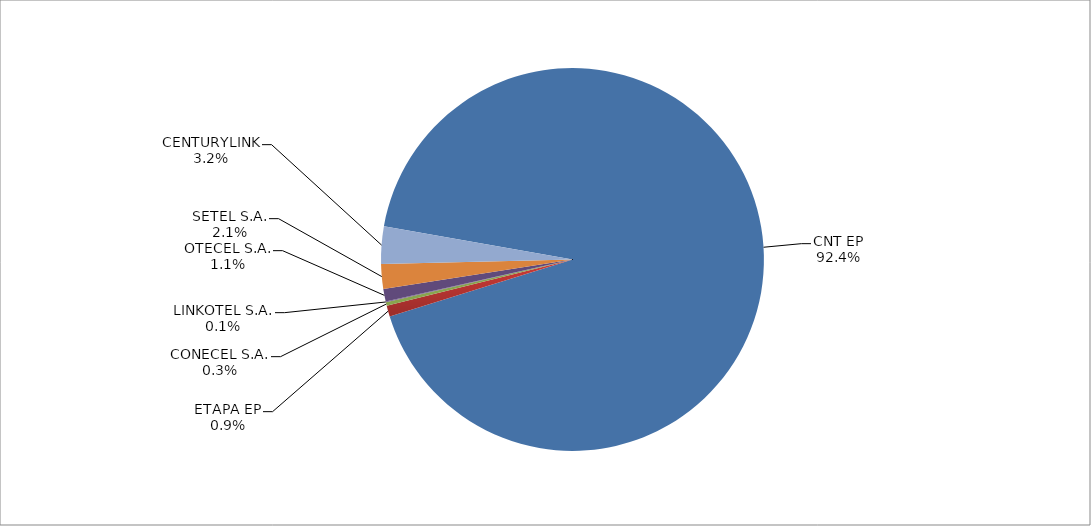
| Category | Series 0 |
|---|---|
| CNT EP | 2872 |
| ETAPA EP | 29 |
| CONECEL S.A. | 9 |
| LINKOTEL S.A. | 2 |
| OTECEL S.A. | 33 |
| SETEL S.A. | 65 |
| CENTURYLINK | 98 |